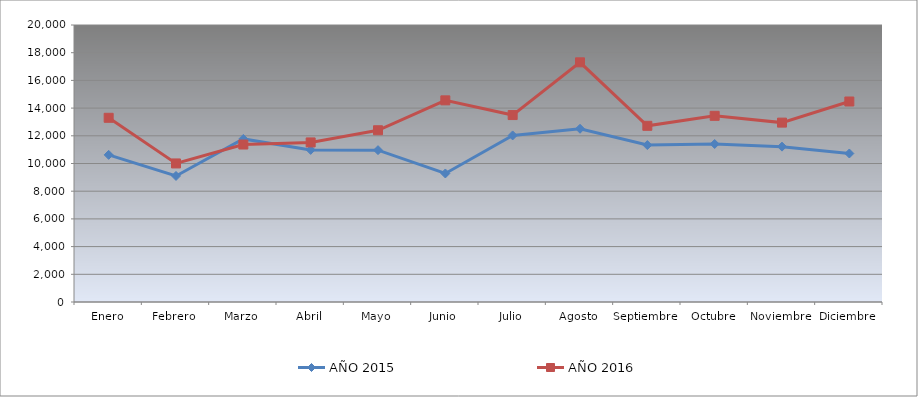
| Category | AÑO 2015 | AÑO 2016 |
|---|---|---|
| Enero | 10624.273 | 13300.432 |
| Febrero | 9100.736 | 10004.343 |
| Marzo | 11773.85 | 11370.66 |
| Abril | 10982.25 | 11521.801 |
| Mayo | 10964.138 | 12400.839 |
| Junio | 9279.725 | 14559.136 |
| Julio | 12026.353 | 13496.311 |
| Agosto | 12508.984 | 17305.071 |
| Septiembre | 11330.64 | 12721.258 |
| Octubre | 11408.415 | 13441.9 |
| Noviembre | 11217.706 | 12952.202 |
| Diciembre | 10722.29 | 14476.915 |